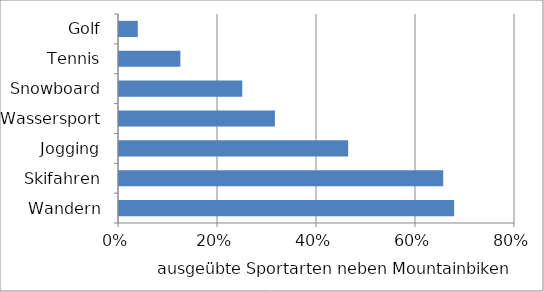
| Category | Series 0 |
|---|---|
| Wandern | 0.677 |
| Skifahren | 0.655 |
| Jogging | 0.463 |
| Wassersport | 0.315 |
| Snowboard | 0.249 |
| Tennis | 0.124 |
| Golf | 0.038 |